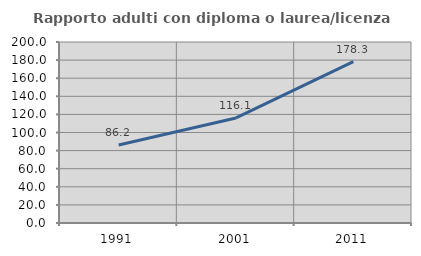
| Category | Rapporto adulti con diploma o laurea/licenza media  |
|---|---|
| 1991.0 | 86.165 |
| 2001.0 | 116.095 |
| 2011.0 | 178.295 |